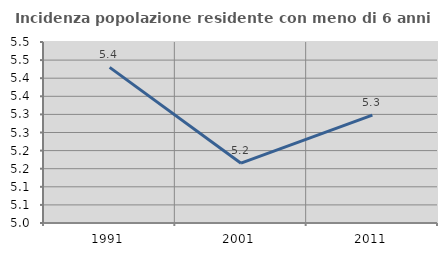
| Category | Incidenza popolazione residente con meno di 6 anni |
|---|---|
| 1991.0 | 5.43 |
| 2001.0 | 5.165 |
| 2011.0 | 5.298 |